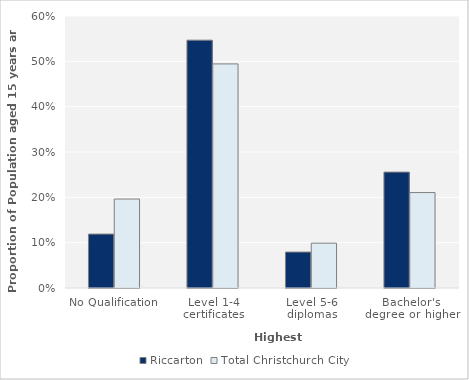
| Category | Riccarton | Total Christchurch City |
|---|---|---|
| No Qualification | 0.119 | 0.196 |
| Level 1-4 certificates | 0.547 | 0.494 |
| Level 5-6 diplomas | 0.079 | 0.099 |
| Bachelor's degree or higher | 0.256 | 0.211 |